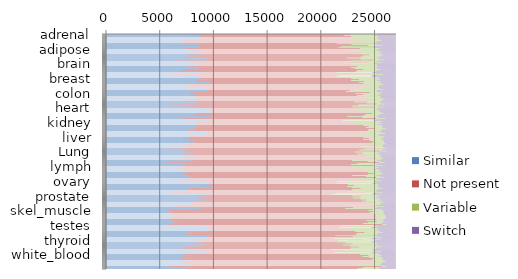
| Category | Similar | Not present | Variable | Switch |
|---|---|---|---|---|
| adrenal | 8834 | 13946 | 2527 | 1682 |
|  | 8043 | 14106 | 2871 | 1969 |
|  | 8694 | 14128 | 2511 | 1656 |
|  | 7564 | 15667 | 2103 | 1655 |
|  | 8895 | 13931 | 2416 | 1747 |
|  | 8428 | 14775 | 2245 | 1541 |
|  | 7092 | 16872 | 1706 | 1319 |
|  | 7295 | 15895 | 2093 | 1706 |
|  | 7048 | 15879 | 2191 | 1871 |
|  | 8888 | 12608 | 3446 | 2047 |
|  | 8496 | 14374 | 2347 | 1772 |
|  | 5679 | 18731 | 1310 | 1269 |
|  | 8722 | 13168 | 3081 | 2018 |
|  | 8539 | 13111 | 3340 | 1999 |
|  | 7327 | 16328 | 1814 | 1520 |
| adipose | 8834 | 13946 | 2527 | 1682 |
|  | 8638 | 14226 | 2350 | 1775 |
|  | 9486 | 14078 | 1969 | 1456 |
|  | 8385 | 15570 | 1627 | 1407 |
|  | 9607 | 13913 | 1877 | 1592 |
|  | 9083 | 14906 | 1708 | 1292 |
|  | 7671 | 16830 | 1317 | 1171 |
|  | 8052 | 15895 | 1600 | 1442 |
|  | 7421 | 16300 | 1659 | 1609 |
|  | 9546 | 12878 | 2787 | 1778 |
|  | 9208 | 14496 | 1748 | 1537 |
|  | 6272 | 18644 | 967 | 1106 |
|  | 9458 | 13424 | 2390 | 1717 |
|  | 9090 | 13248 | 2787 | 1864 |
|  | 7875 | 16557 | 1219 | 1338 |
| brain | 8043 | 14106 | 2871 | 1969 |
|  | 8638 | 14226 | 2350 | 1775 |
|  | 8563 | 14265 | 2413 | 1748 |
|  | 7694 | 15692 | 1887 | 1716 |
|  | 9203 | 13598 | 2345 | 1843 |
|  | 8420 | 14782 | 2106 | 1681 |
|  | 7031 | 16907 | 1638 | 1413 |
|  | 7177 | 16228 | 1846 | 1738 |
|  | 6664 | 16599 | 1865 | 1861 |
|  | 9041 | 12438 | 3318 | 2192 |
|  | 8565 | 14457 | 2116 | 1851 |
|  | 5996 | 18560 | 1246 | 1187 |
|  | 8895 | 12768 | 3062 | 2264 |
|  | 8583 | 12883 | 3270 | 2253 |
|  | 7270 | 16617 | 1579 | 1523 |
| breast | 8694 | 14128 | 2511 | 1656 |
|  | 9486 | 14078 | 1969 | 1456 |
|  | 8563 | 14265 | 2413 | 1748 |
|  | 8318 | 15702 | 1580 | 1389 |
|  | 9607 | 13935 | 1891 | 1556 |
|  | 9137 | 14852 | 1688 | 1312 |
|  | 7730 | 16868 | 1225 | 1166 |
|  | 7812 | 16125 | 1553 | 1499 |
|  | 7282 | 16464 | 1661 | 1582 |
|  | 9550 | 12978 | 2801 | 1660 |
|  | 9226 | 14468 | 1769 | 1526 |
|  | 6402 | 18504 | 933 | 1150 |
|  | 9399 | 13305 | 2516 | 1769 |
|  | 9132 | 13184 | 2870 | 1803 |
|  | 7714 | 16841 | 1142 | 1292 |
| colon | 7564 | 15667 | 2103 | 1655 |
|  | 8385 | 15570 | 1627 | 1407 |
|  | 7694 | 15692 | 1887 | 1716 |
|  | 8318 | 15702 | 1580 | 1389 |
|  | 8637 | 15383 | 1434 | 1535 |
|  | 8358 | 16109 | 1271 | 1251 |
|  | 7059 | 17874 | 953 | 1103 |
|  | 7475 | 17002 | 1169 | 1343 |
|  | 7139 | 17273 | 1212 | 1365 |
|  | 8468 | 14627 | 2327 | 1567 |
|  | 8608 | 15677 | 1320 | 1384 |
|  | 5893 | 19347 | 685 | 1064 |
|  | 8583 | 14928 | 1906 | 1572 |
|  | 7907 | 15008 | 2325 | 1749 |
|  | 6954 | 17985 | 871 | 1179 |
| heart | 8895 | 13931 | 2416 | 1747 |
|  | 9607 | 13913 | 1877 | 1592 |
|  | 9203 | 13598 | 2345 | 1843 |
|  | 9607 | 13935 | 1891 | 1556 |
|  | 8637 | 15383 | 1434 | 1535 |
|  | 9586 | 14600 | 1471 | 1332 |
|  | 8239 | 16570 | 1041 | 1139 |
|  | 8343 | 15849 | 1281 | 1516 |
|  | 7817 | 16151 | 1396 | 1625 |
|  | 9904 | 12535 | 2764 | 1786 |
|  | 9869 | 14007 | 1529 | 1584 |
|  | 7131 | 18050 | 825 | 983 |
|  | 9908 | 12800 | 2482 | 1799 |
|  | 9422 | 12599 | 2964 | 2004 |
|  | 8290 | 16467 | 931 | 1301 |
| kidney | 8428 | 14775 | 2245 | 1541 |
|  | 9083 | 14906 | 1708 | 1292 |
|  | 8420 | 14782 | 2106 | 1681 |
|  | 9137 | 14852 | 1688 | 1312 |
|  | 8358 | 16109 | 1271 | 1251 |
|  | 9586 | 14600 | 1471 | 1332 |
|  | 8149 | 16854 | 1040 | 946 |
|  | 8028 | 16406 | 1237 | 1318 |
|  | 7643 | 16729 | 1220 | 1397 |
|  | 9325 | 13562 | 2545 | 1557 |
|  | 9402 | 14878 | 1395 | 1314 |
|  | 6347 | 18938 | 727 | 977 |
|  | 9348 | 13886 | 2231 | 1524 |
|  | 8908 | 13816 | 2636 | 1629 |
|  | 7895 | 17111 | 894 | 1089 |
| liver | 7092 | 16872 | 1706 | 1319 |
|  | 7671 | 16830 | 1317 | 1171 |
|  | 7031 | 16907 | 1638 | 1413 |
|  | 7730 | 16868 | 1225 | 1166 |
|  | 7059 | 17874 | 953 | 1103 |
|  | 8239 | 16570 | 1041 | 1139 |
|  | 8149 | 16854 | 1040 | 946 |
|  | 7032 | 17944 | 841 | 1172 |
|  | 6655 | 18228 | 902 | 1204 |
|  | 7666 | 16053 | 1999 | 1271 |
|  | 7981 | 16893 | 961 | 1154 |
|  | 5836 | 19816 | 447 | 890 |
|  | 7692 | 16379 | 1645 | 1273 |
|  | 7420 | 16159 | 2057 | 1353 |
|  | 7107 | 18378 | 574 | 930 |
| Lung | 7295 | 15895 | 2093 | 1706 |
|  | 8052 | 15895 | 1600 | 1442 |
|  | 7177 | 16228 | 1846 | 1738 |
|  | 7812 | 16125 | 1553 | 1499 |
|  | 7475 | 17002 | 1169 | 1343 |
|  | 8343 | 15849 | 1281 | 1516 |
|  | 8028 | 16406 | 1237 | 1318 |
|  | 7032 | 17944 | 841 | 1172 |
|  | 7124 | 17259 | 1181 | 1425 |
|  | 7865 | 15043 | 2328 | 1753 |
|  | 8389 | 15972 | 1186 | 1442 |
|  | 5776 | 19610 | 570 | 1033 |
|  | 7959 | 15424 | 1886 | 1720 |
|  | 7415 | 15396 | 2333 | 1845 |
|  | 7061 | 17847 | 824 | 1257 |
| lymph | 7048 | 15879 | 2191 | 1871 |
|  | 7421 | 16300 | 1659 | 1609 |
|  | 6664 | 16599 | 1865 | 1861 |
|  | 7282 | 16464 | 1661 | 1582 |
|  | 7139 | 17273 | 1212 | 1365 |
|  | 7817 | 16151 | 1396 | 1625 |
|  | 7643 | 16729 | 1220 | 1397 |
|  | 6655 | 18228 | 902 | 1204 |
|  | 7124 | 17259 | 1181 | 1425 |
|  | 7499 | 15422 | 2283 | 1785 |
|  | 7846 | 16360 | 1292 | 1491 |
|  | 5430 | 19750 | 672 | 1137 |
|  | 7503 | 15745 | 1977 | 1764 |
|  | 6918 | 15847 | 2373 | 1851 |
|  | 6780 | 17864 | 985 | 1360 |
| ovary | 8888 | 12608 | 3446 | 2047 |
|  | 9546 | 12878 | 2787 | 1778 |
|  | 9041 | 12438 | 3318 | 2192 |
|  | 9550 | 12978 | 2801 | 1660 |
|  | 8468 | 14627 | 2327 | 1567 |
|  | 9904 | 12535 | 2764 | 1786 |
|  | 9325 | 13562 | 2545 | 1557 |
|  | 7666 | 16053 | 1999 | 1271 |
|  | 7865 | 15043 | 2328 | 1753 |
|  | 7499 | 15422 | 2283 | 1785 |
|  | 9469 | 13013 | 2670 | 1837 |
|  | 6106 | 18112 | 1519 | 1252 |
|  | 10158 | 11210 | 3530 | 2091 |
|  | 9539 | 11429 | 3804 | 2217 |
|  | 7899 | 15706 | 1921 | 1463 |
| prostate | 8496 | 14374 | 2347 | 1772 |
|  | 9208 | 14496 | 1748 | 1537 |
|  | 8565 | 14457 | 2116 | 1851 |
|  | 9226 | 14468 | 1769 | 1526 |
|  | 8608 | 15677 | 1320 | 1384 |
|  | 9869 | 14007 | 1529 | 1584 |
|  | 9402 | 14878 | 1395 | 1314 |
|  | 7981 | 16893 | 961 | 1154 |
|  | 8389 | 15972 | 1186 | 1442 |
|  | 7846 | 16360 | 1292 | 1491 |
|  | 9469 | 13013 | 2670 | 1837 |
|  | 6525 | 18672 | 723 | 1069 |
|  | 9506 | 13485 | 2215 | 1783 |
|  | 8826 | 13466 | 2749 | 1948 |
|  | 7971 | 16860 | 892 | 1266 |
| skel_muscle | 5679 | 18731 | 1310 | 1269 |
|  | 6272 | 18644 | 967 | 1106 |
|  | 5996 | 18560 | 1246 | 1187 |
|  | 6402 | 18504 | 933 | 1150 |
|  | 5893 | 19347 | 685 | 1064 |
|  | 7131 | 18050 | 825 | 983 |
|  | 6347 | 18938 | 727 | 977 |
|  | 5836 | 19816 | 447 | 890 |
|  | 5776 | 19610 | 570 | 1033 |
|  | 5430 | 19750 | 672 | 1137 |
|  | 6106 | 18112 | 1519 | 1252 |
|  | 6525 | 18672 | 723 | 1069 |
|  | 6358 | 18064 | 1307 | 1260 |
|  | 6043 | 17871 | 1713 | 1362 |
|  | 5829 | 19887 | 376 | 897 |
| testes | 8722 | 13168 | 3081 | 2018 |
|  | 9458 | 13424 | 2390 | 1717 |
|  | 8895 | 12768 | 3062 | 2264 |
|  | 9399 | 13305 | 2516 | 1769 |
|  | 8583 | 14928 | 1906 | 1572 |
|  | 9908 | 12800 | 2482 | 1799 |
|  | 9348 | 13886 | 2231 | 1524 |
|  | 7692 | 16379 | 1645 | 1273 |
|  | 7959 | 15424 | 1886 | 1720 |
|  | 7503 | 15745 | 1977 | 1764 |
|  | 10158 | 11210 | 3530 | 2091 |
|  | 9506 | 13485 | 2215 | 1783 |
|  | 6358 | 18064 | 1307 | 1260 |
|  | 9456 | 11813 | 3488 | 2232 |
|  | 7867 | 16059 | 1597 | 1466 |
| thyroid | 8539 | 13111 | 3340 | 1999 |
|  | 9090 | 13248 | 2787 | 1864 |
|  | 8583 | 12883 | 3270 | 2253 |
|  | 9132 | 13184 | 2870 | 1803 |
|  | 7907 | 15008 | 2325 | 1749 |
|  | 9422 | 12599 | 2964 | 2004 |
|  | 8908 | 13816 | 2636 | 1629 |
|  | 7420 | 16159 | 2057 | 1353 |
|  | 7415 | 15396 | 2333 | 1845 |
|  | 6918 | 15847 | 2373 | 1851 |
|  | 9539 | 11429 | 3804 | 2217 |
|  | 8826 | 13466 | 2749 | 1948 |
|  | 6043 | 17871 | 1713 | 1362 |
|  | 9456 | 11813 | 3488 | 2232 |
|  | 7367 | 16080 | 1963 | 1579 |
| white_blood | 7327 | 16328 | 1814 | 1520 |